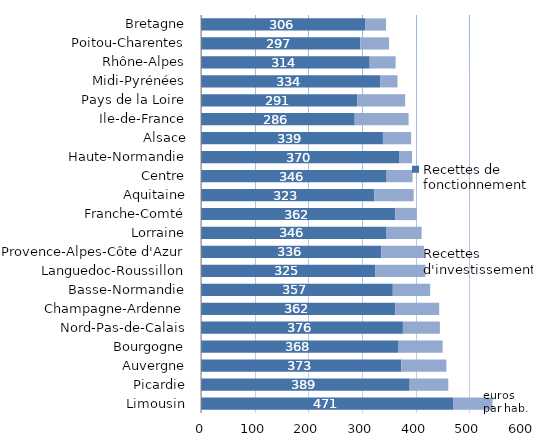
| Category | Recettes de fonctionnement | Recettes d'investissement |
|---|---|---|
| Limousin | 470.561 | 72.492 |
| Picardie | 388.893 | 71.903 |
| Auvergne | 373.221 | 84.039 |
| Bourgogne | 368.25 | 81.914 |
| Nord-Pas-de-Calais | 376.247 | 68.888 |
| Champagne-Ardenne | 361.908 | 81.942 |
| Basse-Normandie | 357.379 | 69.663 |
| Languedoc-Roussillon | 325.135 | 93.007 |
| Provence-Alpes-Côte d'Azur | 336.017 | 79.422 |
| Lorraine | 345.796 | 65.301 |
| Franche-Comté | 362.186 | 39.851 |
| Aquitaine | 322.707 | 73.576 |
| Centre | 345.902 | 48.25 |
| Haute-Normandie | 369.954 | 23.297 |
| Alsace | 338.974 | 52.601 |
| Ile-de-France | 286.431 | 100.402 |
| Pays de la Loire | 290.959 | 89.511 |
| Midi-Pyrénées | 333.656 | 32.512 |
| Rhône-Alpes | 314.346 | 48.26 |
| Poitou-Charentes | 296.888 | 53.514 |
| Bretagne | 305.682 | 39.119 |